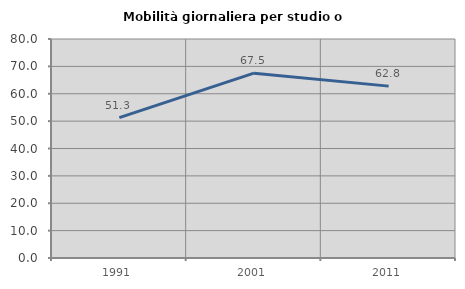
| Category | Mobilità giornaliera per studio o lavoro |
|---|---|
| 1991.0 | 51.27 |
| 2001.0 | 67.514 |
| 2011.0 | 62.786 |